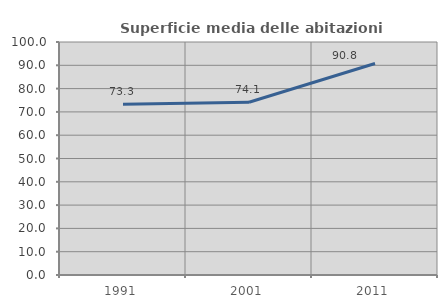
| Category | Superficie media delle abitazioni occupate |
|---|---|
| 1991.0 | 73.259 |
| 2001.0 | 74.117 |
| 2011.0 | 90.76 |